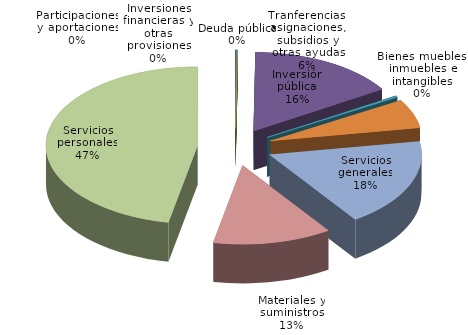
| Category | Series 0 |
|---|---|
| Deuda pública | 38375 |
| Participaciones y aportaciones | 0 |
| Inversiones financieras y otras provisiones | 0 |
| Inversión pública | 3130749 |
| Bienes muebles, inmuebles e intangibles | 65000 |
| Tranferencias, asignaciones, subsidios y otras ayudas | 1164800 |
| Servicios generales | 3577000 |
| Materiales y suministros | 2490000 |
| Servicios personales | 9250104 |